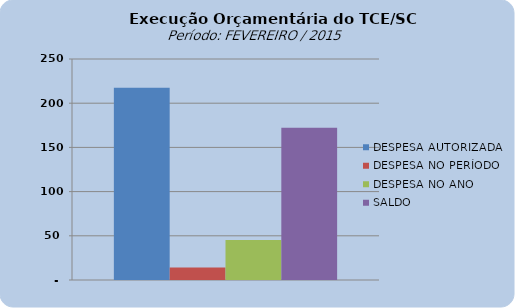
| Category | DESPESA AUTORIZADA | DESPESA NO PERÍODO | DESPESA NO ANO | SALDO |
|---|---|---|---|---|
| 0 | 217343978.06 | 14221359.21 | 45181350.19 | 172162627.87 |